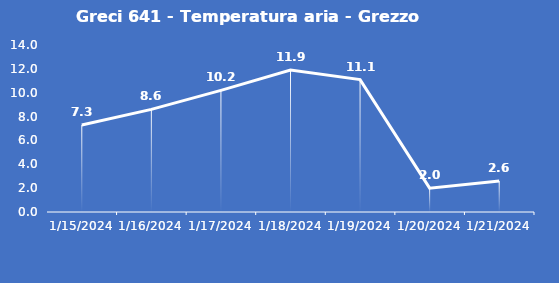
| Category | Greci 641 - Temperatura aria - Grezzo (°C) |
|---|---|
| 1/15/24 | 7.3 |
| 1/16/24 | 8.6 |
| 1/17/24 | 10.2 |
| 1/18/24 | 11.9 |
| 1/19/24 | 11.1 |
| 1/20/24 | 2 |
| 1/21/24 | 2.6 |